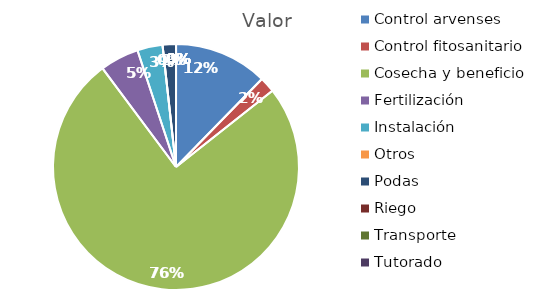
| Category | Valor |
|---|---|
| Control arvenses | 10680878 |
| Control fitosanitario | 1774864 |
| Cosecha y beneficio | 65496372 |
| Fertilización | 4437160 |
| Instalación | 2884154 |
| Otros | 0 |
| Podas | 1521312 |
| Riego | 0 |
| Transporte | 0 |
| Tutorado | 0 |